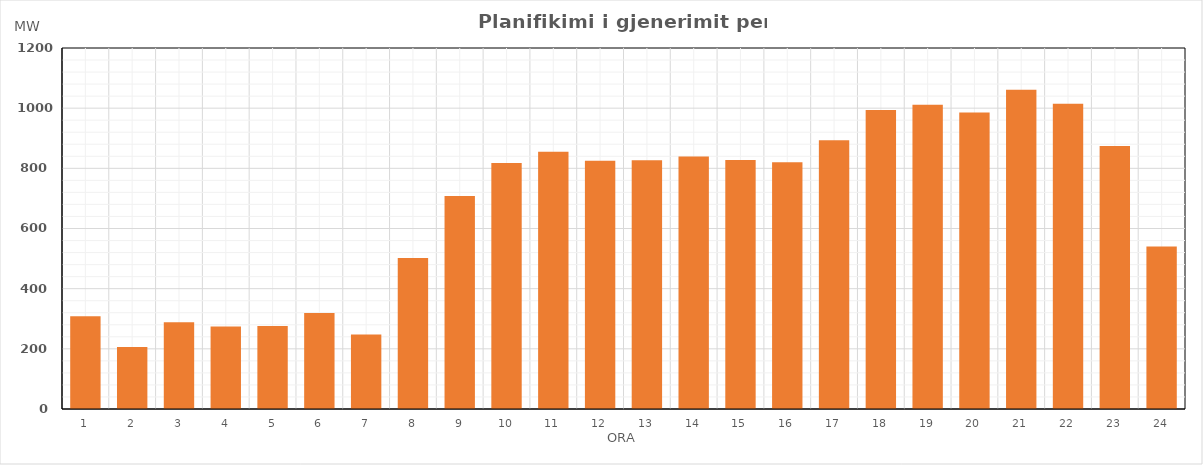
| Category | Max (MW) |
|---|---|
| 0 | 308.595 |
| 1 | 206.06 |
| 2 | 288.3 |
| 3 | 274.26 |
| 4 | 276.28 |
| 5 | 319.319 |
| 6 | 248.004 |
| 7 | 502.274 |
| 8 | 708.359 |
| 9 | 817.964 |
| 10 | 855.15 |
| 11 | 824.985 |
| 12 | 826.94 |
| 13 | 838.95 |
| 14 | 827.945 |
| 15 | 819.87 |
| 16 | 893.069 |
| 17 | 994.054 |
| 18 | 1011.004 |
| 19 | 985.844 |
| 20 | 1061.004 |
| 21 | 1014.91 |
| 22 | 874.259 |
| 23 | 540.544 |